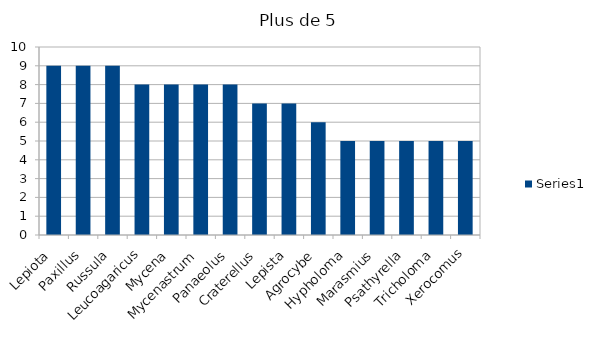
| Category | Series 0 |
|---|---|
| Lepiota | 9 |
| Paxillus | 9 |
| Russula | 9 |
| Leucoagaricus | 8 |
| Mycena | 8 |
| Mycenastrum | 8 |
| Panaeolus | 8 |
| Craterellus | 7 |
| Lepista | 7 |
| Agrocybe | 6 |
| Hypholoma | 5 |
| Marasmius | 5 |
| Psathyrella | 5 |
| Tricholoma | 5 |
| Xerocomus | 5 |